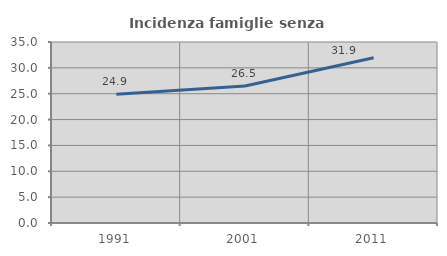
| Category | Incidenza famiglie senza nuclei |
|---|---|
| 1991.0 | 24.888 |
| 2001.0 | 26.499 |
| 2011.0 | 31.947 |